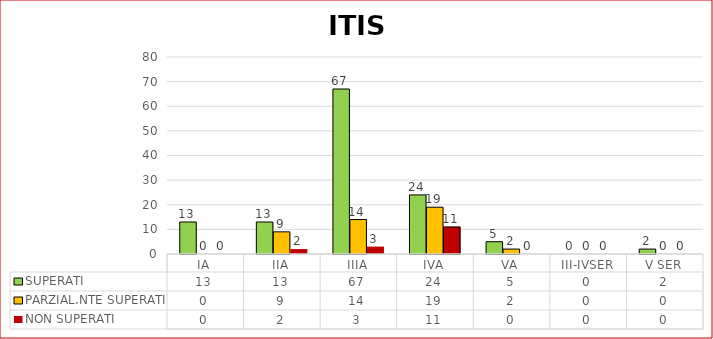
| Category | SUPERATI | PARZIAL.NTE SUPERATI | NON SUPERATI |
|---|---|---|---|
| IA | 13 | 0 | 0 |
| IIA | 13 | 9 | 2 |
| IIIA | 67 | 14 | 3 |
| IVA | 24 | 19 | 11 |
| VA | 5 | 2 | 0 |
| III-IVSER | 0 | 0 | 0 |
| V SER | 2 | 0 | 0 |